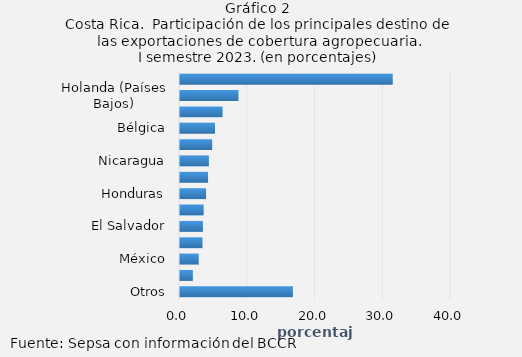
| Category | Series 0 |
|---|---|
| Otros | 16.663 |
| China | 1.897 |
| México | 2.763 |
| Italia | 3.318 |
| El Salvador | 3.383 |
| Reino Unido | 3.492 |
| Honduras | 3.851 |
| Panamá | 4.141 |
| Nicaragua | 4.261 |
| España | 4.749 |
| Bélgica | 5.167 |
| Guatemala | 6.287 |
| Holanda (Países Bajos) | 8.63 |
| Estados Unidos | 31.4 |